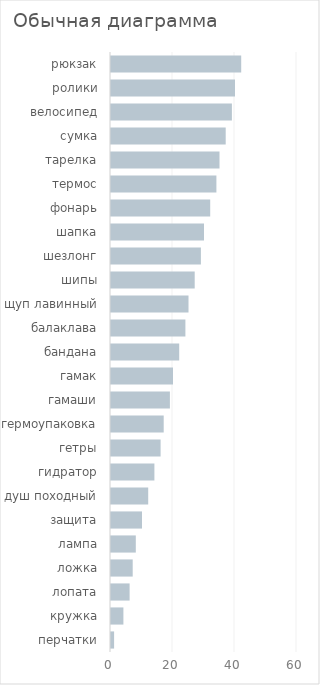
| Category | Количество |
|---|---|
| рюкзак | 42 |
| ролики | 40 |
| велосипед | 39 |
| сумка | 37 |
| тарелка | 35 |
| термос | 34 |
| фонарь | 32 |
| шапка | 30 |
| шезлонг | 29 |
| шипы | 27 |
| щуп лавинный | 25 |
| балаклава | 24 |
| бандана | 22 |
| гамак | 20 |
| гамаши | 19 |
| гермоупаковка | 17 |
| гетры | 16 |
| гидратор | 14 |
| душ походный | 12 |
| защита | 10 |
| лампа | 8 |
| ложка | 7 |
| лопата | 6 |
| кружка | 4 |
| перчатки | 1 |